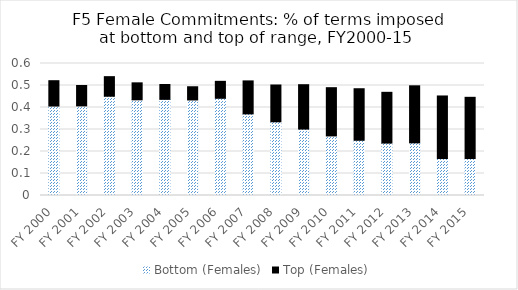
| Category | Bottom (Females) | Top (Females) |
|---|---|---|
| FY 2000 | 0.406 | 0.115 |
| FY 2001 | 0.407 | 0.093 |
| FY 2002 | 0.451 | 0.089 |
| FY 2003 | 0.435 | 0.077 |
| FY 2004 | 0.437 | 0.067 |
| FY 2005 | 0.434 | 0.06 |
| FY 2006 | 0.442 | 0.077 |
| FY 2007 | 0.371 | 0.15 |
| FY 2008 | 0.335 | 0.167 |
| FY 2009 | 0.302 | 0.202 |
| FY 2010 | 0.271 | 0.219 |
| FY 2011 | 0.251 | 0.234 |
| FY 2012 | 0.238 | 0.231 |
| FY 2013 | 0.239 | 0.259 |
| FY 2014 | 0.168 | 0.284 |
| FY 2015 | 0.168 | 0.278 |